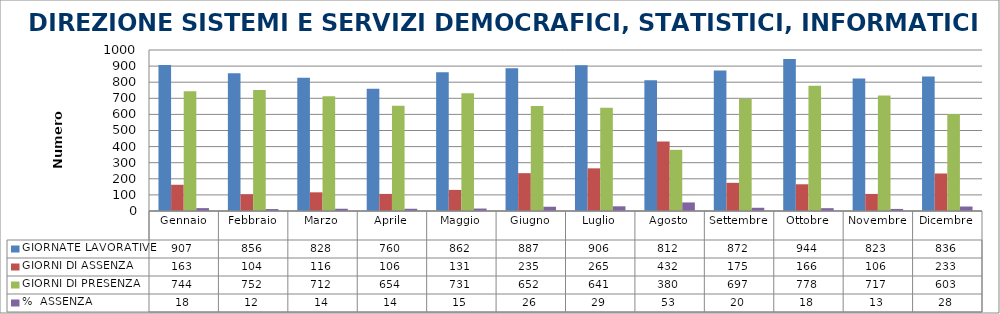
| Category | GIORNATE LAVORATIVE | GIORNI DI ASSENZA | GIORNI DI PRESENZA | %  ASSENZA |
|---|---|---|---|---|
| Gennaio | 907 | 163 | 744 | 17.971 |
| Febbraio | 856 | 104 | 752 | 12.15 |
| Marzo | 828 | 116 | 712 | 14.01 |
| Aprile | 760 | 106 | 654 | 13.947 |
| Maggio | 862 | 131 | 731 | 15.197 |
| Giugno | 887 | 235 | 652 | 26.494 |
| Luglio | 906 | 265 | 641 | 29.249 |
| Agosto | 812 | 432 | 380 | 53.202 |
| Settembre | 872 | 175 | 697 | 20.069 |
| Ottobre | 944 | 166 | 778 | 17.585 |
| Novembre | 823 | 106 | 717 | 12.88 |
| Dicembre | 836 | 233 | 603 | 27.871 |